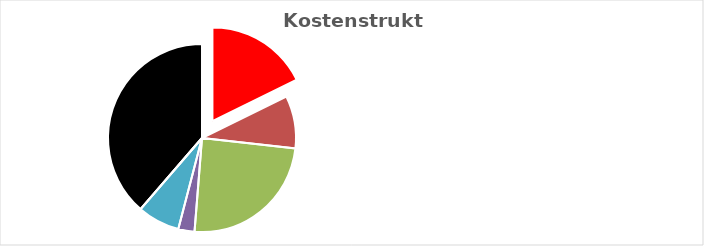
| Category | Series 0 |
|---|---|
| KV-Entgelt produktiv Tätige | 1 |
| Weitere Personalkosten produktiv | 0.51 |
| Personalnebenkosten | 1.382 |
| Unproduktives Personal | 0.158 |
| Deckung Personalgemeinkosten | 0.411 |
| Umlagen ohne GZ | 0 |
| Gesamtzuschlag | 2.181 |